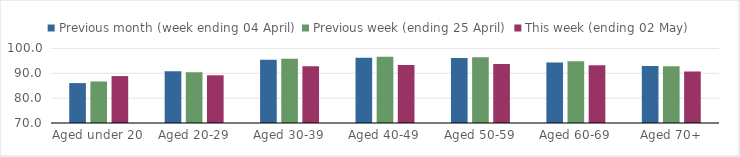
| Category | Previous month (week ending 04 April) | Previous week (ending 25 April) | This week (ending 02 May) |
|---|---|---|---|
| Aged under 20 | 86.059 | 86.711 | 88.876 |
| Aged 20-29 | 90.773 | 90.42 | 89.206 |
| Aged 30-39 | 95.442 | 95.807 | 92.788 |
| Aged 40-49 | 96.296 | 96.7 | 93.361 |
| Aged 50-59 | 96.156 | 96.404 | 93.776 |
| Aged 60-69 | 94.369 | 94.848 | 93.236 |
| Aged 70+ | 92.96 | 92.855 | 90.718 |